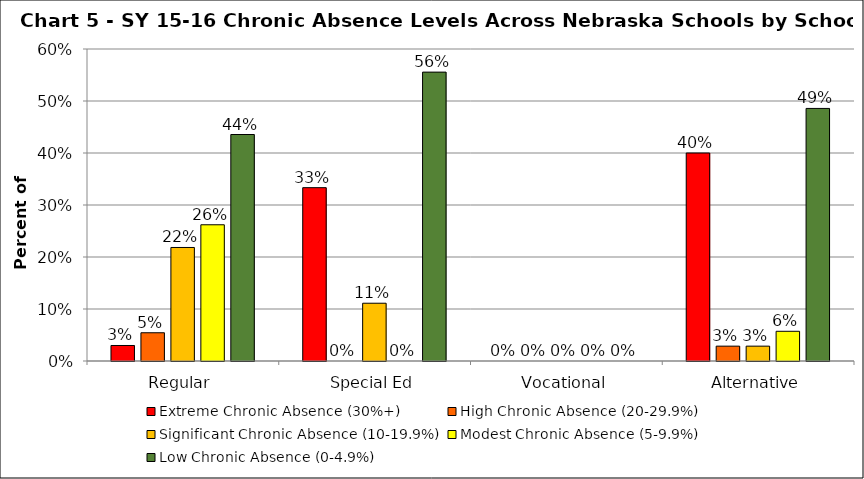
| Category | Extreme Chronic Absence (30%+) | High Chronic Absence (20-29.9%) | Significant Chronic Absence (10-19.9%) | Modest Chronic Absence (5-9.9%) | Low Chronic Absence (0-4.9%) |
|---|---|---|---|---|---|
| 0 | 0.03 | 0.054 | 0.218 | 0.262 | 0.436 |
| 1 | 0.333 | 0 | 0.111 | 0 | 0.556 |
| 2 | 0 | 0 | 0 | 0 | 0 |
| 3 | 0.4 | 0.029 | 0.029 | 0.057 | 0.486 |